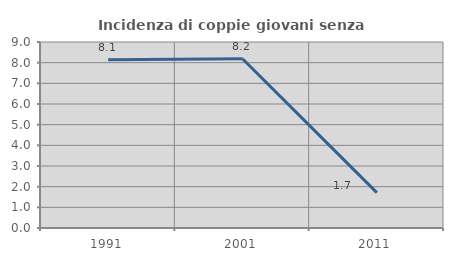
| Category | Incidenza di coppie giovani senza figli |
|---|---|
| 1991.0 | 8.146 |
| 2001.0 | 8.189 |
| 2011.0 | 1.711 |